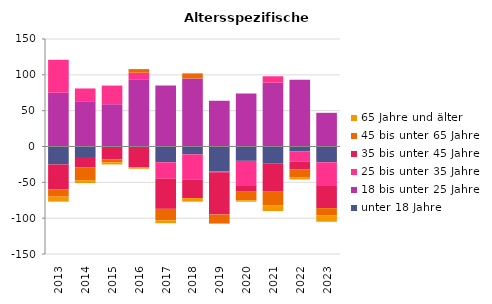
| Category | unter 18 Jahre | 18 bis unter 25 Jahre | 25 bis unter 35 Jahre | 35 bis unter 45 Jahre | 45 bis unter 65 Jahre | 65 Jahre und älter |
|---|---|---|---|---|---|---|
| 2013.0 | -25 | 75 | 46 | -35 | -10 | -7 |
| 2014.0 | -16 | 63 | 18 | -13 | -18 | -4 |
| 2015.0 | -2 | 59 | 26 | -16 | -4 | -3 |
| 2016.0 | 0 | 94 | 9 | -29 | 5 | -2 |
| 2017.0 | -22 | 85 | -23 | -42 | -16 | -4 |
| 2018.0 | -11 | 95 | -35 | -26 | 7 | -5 |
| 2019.0 | -35 | 64 | -1 | -59 | -12 | -1 |
| 2020.0 | -20 | 74 | -34 | -9 | -12 | -2 |
| 2021.0 | -24 | 89 | 9 | -39 | -19 | -8 |
| 2022.0 | -7 | 93 | -14 | -11 | -11 | -3 |
| 2023.0 | -22 | 47 | -32 | -32 | -10 | -9 |